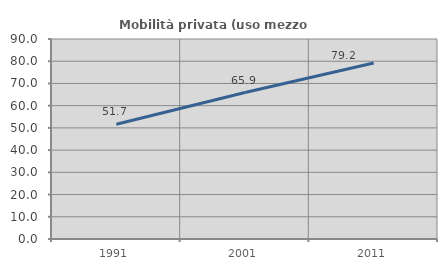
| Category | Mobilità privata (uso mezzo privato) |
|---|---|
| 1991.0 | 51.667 |
| 2001.0 | 65.902 |
| 2011.0 | 79.228 |